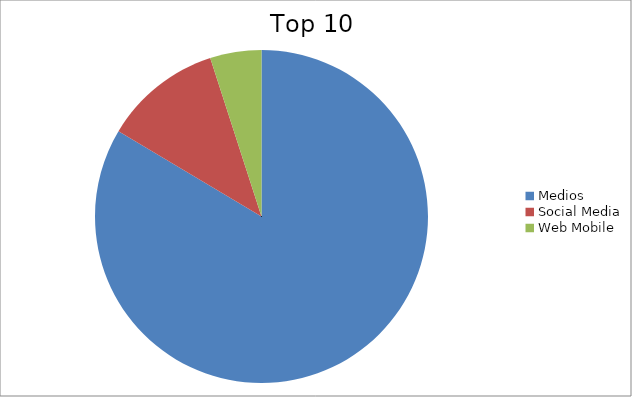
| Category | Series 0 |
|---|---|
| Medios | 83.56 |
| Social Media | 11.46 |
| Web Mobile | 4.98 |